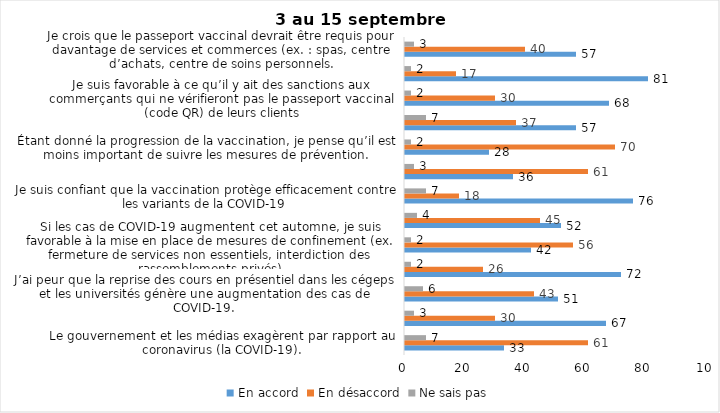
| Category | En accord | En désaccord | Ne sais pas |
|---|---|---|---|
| Le gouvernement et les médias exagèrent par rapport au coronavirus (la COVID-19). | 33 | 61 | 7 |
| J’ai peur que le système de santé soit débordé par les cas de COVID-19 suite au "déconfinement" | 67 | 30 | 3 |
| J’ai peur que la reprise des cours en présentiel dans les cégeps et les universités génère une augmentation des cas de COVID-19. | 51 | 43 | 6 |
| Je suis favorable au passeport vaccinal qui permettrait l'accès à certains lieux ou activités aux personnes vaccinées. | 72 | 26 | 2 |
| Si les cas de COVID-19 augmentent cet automne, je suis favorable à la mise en place de mesures de confinement (ex. fermeture de services non essentiels, interdiction des rassemblements privés) | 42 | 56 | 2 |
| Je suis inquiet de contracter le variant Delta de la Covid-19 | 52 | 45 | 4 |
| Je suis confiant que la vaccination protège efficacement contre les variants de la COVID-19 | 76 | 18 | 7 |
| Je suis favorable à ce que le port du masque ne soit plus obligatoire au Québec. | 36 | 61 | 3 |
| Étant donné la progression de la vaccination, je pense qu’il est moins important de suivre les mesures de prévention. | 28 | 70 | 2 |
| J'ai peur que la reprise des cours en présentiel dans les écoles primaires et secondaires génère une augmentation des cas de COVID-19 | 57 | 37 | 7 |
| Je suis favorable à ce qu’il y ait des sanctions aux commerçants qui ne vérifieront pas le passeport vaccinal (code QR) de leurs clients | 68 | 30 | 2 |
| Je suis favorable à ce qu’il y ait des sanctions aux gens qui tenteront de frauder leur passeport vaccinal par des amendes ou des accusations criminelles. | 81 | 17 | 2 |
| Je crois que le passeport vaccinal devrait être requis pour davantage de services et commerces (ex. : spas, centre d’achats, centre de soins personnels. | 57 | 40 | 3 |